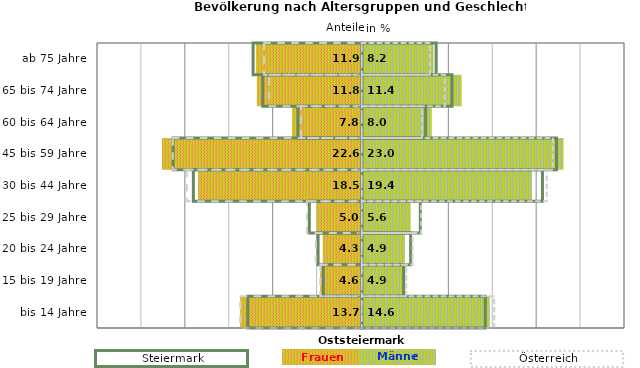
| Category | Frauen | Männer | Frauen Spalte2 | Männer Spalte2 | Frauen Spalte3 | Männer Spalte3 |
|---|---|---|---|---|---|---|
| bis 14 Jahre | -13.7 | 14.6 | 14.1 | -13 | -13.8 | 15.1 |
| 15 bis 19 Jahre | -4.6 | 4.9 | 4.8 | -4.4 | -4.7 | 5.1 |
| 20 bis 24 Jahre | -4.3 | 4.9 | 5.6 | -5 | -5.2 | 5.8 |
| 25 bis 29 Jahre | -5 | 5.6 | 6.7 | -6 | -6.2 | 6.8 |
| 30 bis 44 Jahre | -18.5 | 19.4 | 20.6 | -19.2 | -19.9 | 21.1 |
| 45 bis 59 Jahre | -22.6 | 23 | 22.2 | -21.5 | -21.5 | 21.8 |
| 60 bis 64 Jahre | -7.8 | 8 | 7.3 | -7.3 | -6.9 | 6.9 |
| 65 bis 74 Jahre | -11.8 | 11.4 | 10.3 | -11.3 | -10.5 | 9.5 |
| ab 75 Jahre | -11.9 | 8.2 | 8.5 | -12.4 | -11.1 | 7.8 |